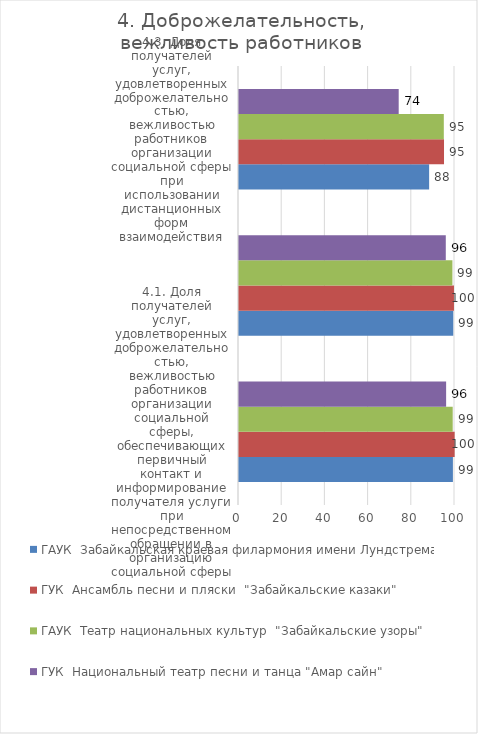
| Category | ГАУК  Забайкальская краевая филармония имени Лундстрема  | ГУК  Ансамбль песни и пляски  "Забайкальские казаки" | ГАУК  Театр национальных культур  "Забайкальские узоры" | ГУК  Национальный театр песни и танца "Амар сайн" |
|---|---|---|---|---|
| 4.1. Доля получателей услуг, удовлетворенных доброжелательностью, вежливостью работников организации социальной сферы, обеспечивающих первичный контакт и информирование получателя услуги при непосредственном обращении в организацию социальной сферы  | 99.029 | 99.841 | 98.938 | 95.893 |
| 4.2. Доля получателей услуг, удовлетворенных доброжелательностью, вежливостью работников организации социальной сферы, обеспечивающих непосредственное оказание услуги при обращении в организацию социальной сферы | 99.191 | 99.523 | 98.805 | 95.735 |
| 4.3. Доля получателей услуг, удовлетворенных доброжелательностью, вежливостью работников организации социальной сферы при использовании дистанционных форм взаимодействия | 88.026 | 94.913 | 94.821 | 73.934 |